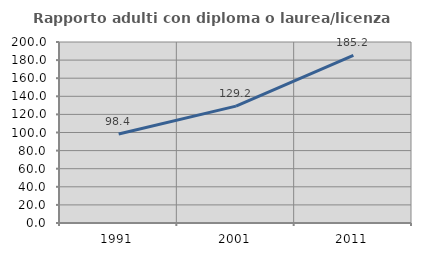
| Category | Rapporto adulti con diploma o laurea/licenza media  |
|---|---|
| 1991.0 | 98.354 |
| 2001.0 | 129.179 |
| 2011.0 | 185.165 |